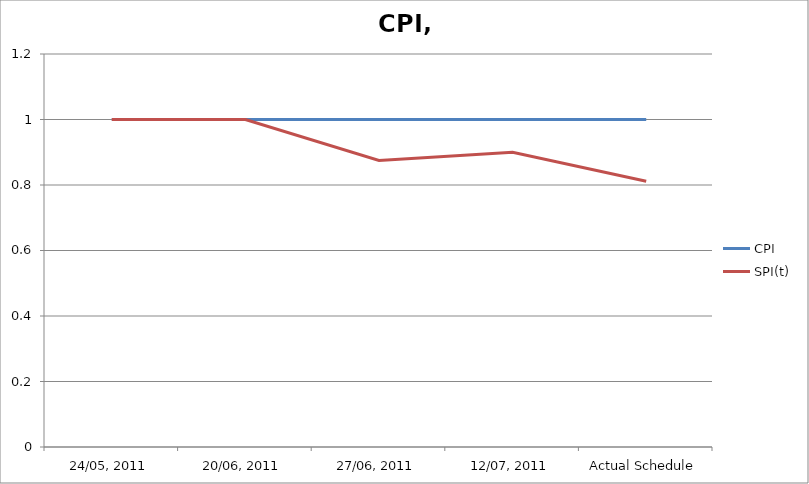
| Category | CPI | SPI(t) |
|---|---|---|
| 24/05, 2011 | 1 | 1 |
| 20/06, 2011 | 1 | 1 |
| 27/06, 2011 | 1 | 0.875 |
| 12/07, 2011 | 1 | 0.9 |
| Actual Schedule | 1 | 0.811 |